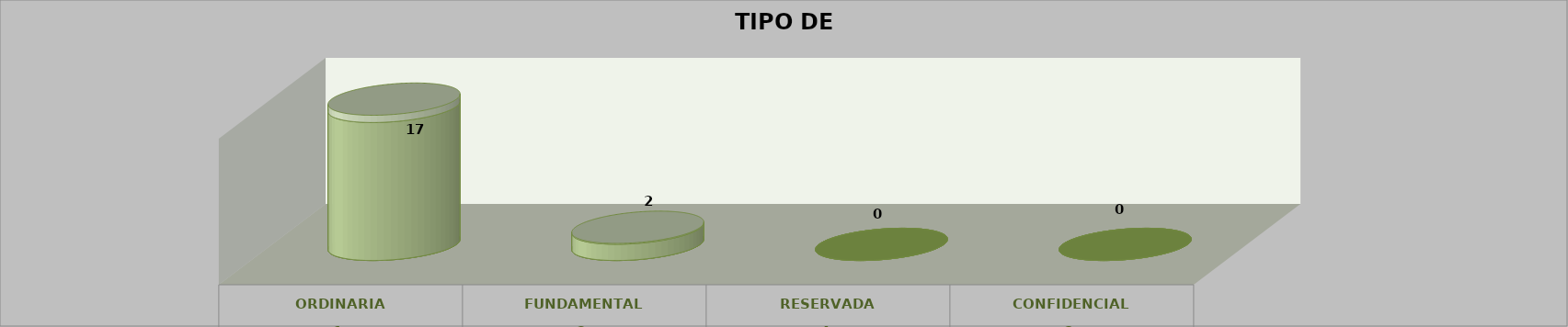
| Category | Series 0 | Series 2 | Series 1 | Series 3 | Series 4 |
|---|---|---|---|---|---|
| 0 |  |  |  | 17 | 0.895 |
| 1 |  |  |  | 2 | 0.105 |
| 2 |  |  |  | 0 | 0 |
| 3 |  |  |  | 0 | 0 |